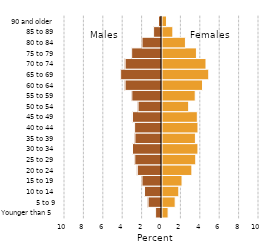
| Category | Series 0 |
|---|---|
| Younger than 5 | 0.63 |
| 5 to 9 | 1.358 |
| 10 to 14 | 1.733 |
| 15 to 19 | 2.066 |
| 20 to 24 | 3.079 |
| 25 to 29 | 3.481 |
| 30 to 34 | 3.706 |
| 35 to 39 | 3.446 |
| 40 to 44 | 3.709 |
| 45 to 49 | 3.643 |
| 50 to 54 | 2.748 |
| 55 to 59 | 3.425 |
| 60 to 64 | 4.177 |
| 65 to 69 | 4.82 |
| 70 to 74 | 4.535 |
| 75 to 79 | 3.551 |
| 80 to 84 | 2.417 |
| 85 to 89 | 1.119 |
| 90 and older | 0.466 |